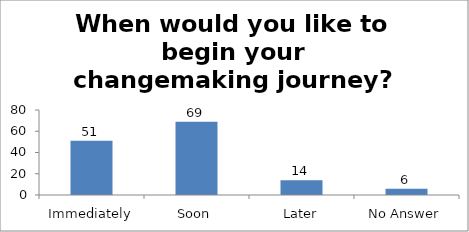
| Category | When would you like to begin your changemaking journey?  |
|---|---|
| Immediately | 51 |
| Soon | 69 |
| Later | 14 |
| No Answer | 6 |